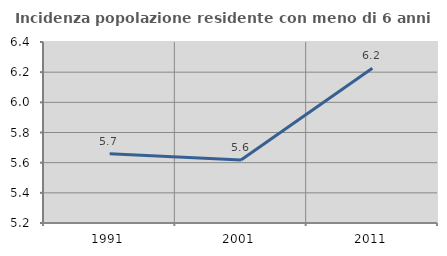
| Category | Incidenza popolazione residente con meno di 6 anni |
|---|---|
| 1991.0 | 5.659 |
| 2001.0 | 5.618 |
| 2011.0 | 6.226 |